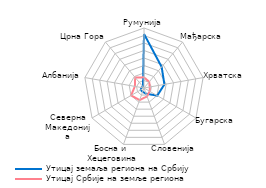
| Category | Утицај земаља региона на Србију | Утицај Србије на земље региона |
|---|---|---|
| Румунија | 0.36 | 0.071 |
| Мађарска | 0.183 | 0.054 |
| Хрватска | 0.138 | 0.039 |
| Бугарска | 0.102 | 0.043 |
| Словенија | 0.04 | 0.06 |
| Босна и 
Хецеговина | 0.027 | 0.086 |
| Северна
Македонија | 0.025 | 0.099 |
| Албанија | 0.017 | 0.062 |
| Црна Гора | 0.01 | 0.091 |